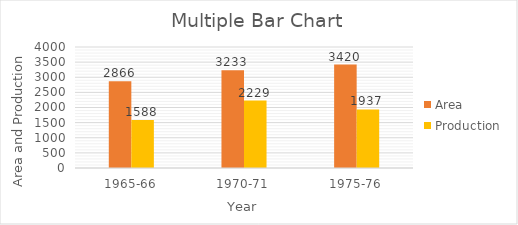
| Category | Area | Production |
|---|---|---|
| 1965-66 | 2866 | 1588 |
| 1970-71 | 3233 | 2229 |
| 1975-76 | 3420 | 1937 |